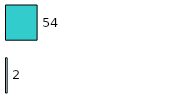
| Category | Series 0 | Series 1 |
|---|---|---|
| 0 | 2 | 54 |